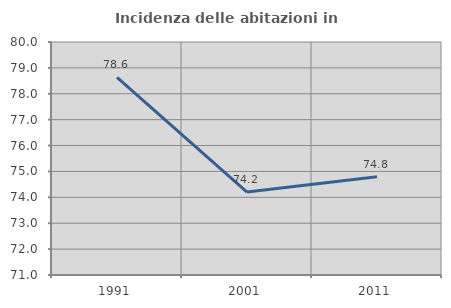
| Category | Incidenza delle abitazioni in proprietà  |
|---|---|
| 1991.0 | 78.635 |
| 2001.0 | 74.203 |
| 2011.0 | 74.791 |